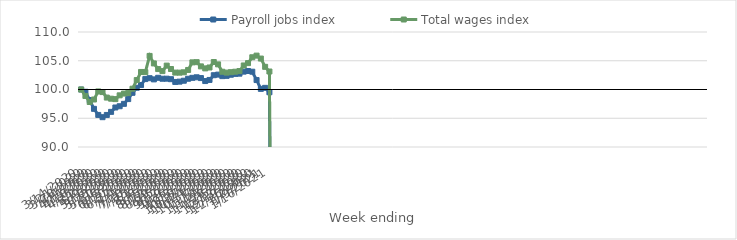
| Category | Payroll jobs index | Total wages index |
|---|---|---|
| 14/03/2020 | 100 | 100 |
| 21/03/2020 | 99.604 | 98.876 |
| 28/03/2020 | 98.169 | 97.826 |
| 04/04/2020 | 96.638 | 98.258 |
| 11/04/2020 | 95.577 | 99.663 |
| 18/04/2020 | 95.186 | 99.551 |
| 25/04/2020 | 95.575 | 98.596 |
| 02/05/2020 | 96.111 | 98.402 |
| 09/05/2020 | 96.872 | 98.329 |
| 16/05/2020 | 97.089 | 98.984 |
| 23/05/2020 | 97.504 | 99.291 |
| 30/05/2020 | 98.333 | 99.38 |
| 06/06/2020 | 99.426 | 100.137 |
| 13/06/2020 | 100.305 | 101.641 |
| 20/06/2020 | 100.774 | 103.05 |
| 27/06/2020 | 101.812 | 103.018 |
| 04/07/2020 | 101.97 | 105.842 |
| 11/07/2020 | 101.76 | 104.535 |
| 18/07/2020 | 102.036 | 103.553 |
| 25/07/2020 | 101.87 | 103.198 |
| 01/08/2020 | 101.882 | 104.154 |
| 08/08/2020 | 101.793 | 103.564 |
| 15/08/2020 | 101.315 | 102.939 |
| 22/08/2020 | 101.369 | 102.93 |
| 29/08/2020 | 101.526 | 102.993 |
| 05/09/2020 | 101.87 | 103.401 |
| 12/09/2020 | 102.028 | 104.72 |
| 19/09/2020 | 102.125 | 104.755 |
| 26/09/2020 | 101.984 | 104.022 |
| 03/10/2020 | 101.467 | 103.672 |
| 10/10/2020 | 101.661 | 103.828 |
| 17/10/2020 | 102.485 | 104.778 |
| 24/10/2020 | 102.589 | 104.37 |
| 31/10/2020 | 102.326 | 103.088 |
| 07/11/2020 | 102.374 | 102.936 |
| 14/11/2020 | 102.567 | 103.014 |
| 21/11/2020 | 102.712 | 103.093 |
| 28/11/2020 | 102.755 | 103.21 |
| 05/12/2020 | 103.108 | 104.18 |
| 12/12/2020 | 103.216 | 104.589 |
| 19/12/2020 | 103.095 | 105.608 |
| 26/12/2020 | 101.642 | 105.892 |
| 02/01/2021 | 100.111 | 105.382 |
| 09/01/2021 | 100.287 | 103.942 |
| 16/01/2021 | 99.518 | 103.128 |